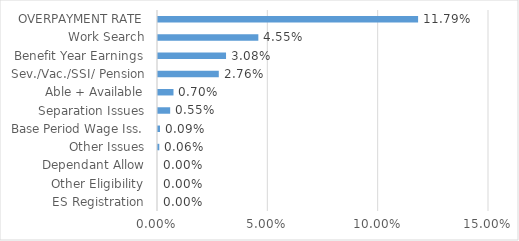
| Category | Series 0 |
|---|---|
| ES Registration | 0 |
| Other Eligibility | 0 |
| Dependant Allow | 0 |
| Other Issues | 0.001 |
| Base Period Wage Iss. | 0.001 |
| Separation Issues | 0.006 |
| Able + Available | 0.007 |
| Sev./Vac./SSI/ Pension | 0.028 |
| Benefit Year Earnings | 0.031 |
| Work Search | 0.045 |
| OVERPAYMENT RATE | 0.118 |